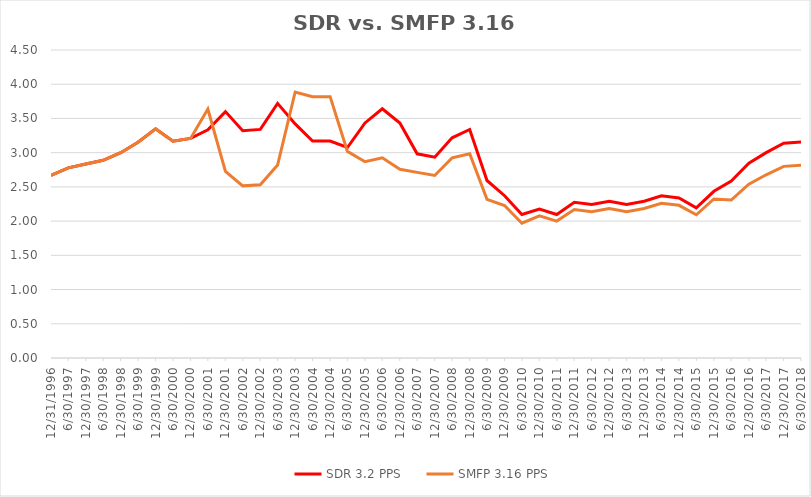
| Category | SDR 3.2 PPS | SMFP 3.16 PPS |
|---|---|---|
| 12/31/96 | 2.667 | 2.667 |
| 6/30/97 | 2.778 | 2.778 |
| 12/31/97 | 2.833 | 2.833 |
| 6/30/98 | 2.889 | 2.889 |
| 12/31/98 | 3 | 3 |
| 6/30/99 | 3.153 | 3.153 |
| 12/31/99 | 3.347 | 3.347 |
| 6/30/00 | 3.167 | 3.167 |
| 12/31/00 | 3.208 | 3.208 |
| 6/30/01 | 3.333 | 3.636 |
| 12/31/01 | 3.6 | 2.727 |
| 6/30/02 | 3.32 | 2.515 |
| 12/31/02 | 3.34 | 2.53 |
| 6/30/03 | 3.72 | 2.818 |
| 12/31/03 | 3.42 | 3.886 |
| 6/30/04 | 3.17 | 3.818 |
| 12/31/04 | 3.17 | 3.818 |
| 6/30/05 | 3.075 | 3.019 |
| 12/31/05 | 3.434 | 2.867 |
| 6/30/06 | 3.642 | 2.924 |
| 12/31/06 | 3.434 | 2.758 |
| 6/30/07 | 2.983 | 2.712 |
| 12/31/07 | 2.933 | 2.667 |
| 6/30/08 | 3.217 | 2.924 |
| 12/31/08 | 3.339 | 2.985 |
| 6/30/09 | 2.593 | 2.318 |
| 12/31/09 | 2.371 | 2.227 |
| 6/30/10 | 2.097 | 1.97 |
| 12/31/10 | 2.177 | 2.077 |
| 6/30/11 | 2.097 | 2 |
| 12/31/11 | 2.274 | 2.169 |
| 6/30/12 | 2.242 | 2.138 |
| 12/31/12 | 2.29 | 2.185 |
| 6/30/13 | 2.242 | 2.138 |
| 12/31/13 | 2.29 | 2.185 |
| 6/30/14 | 2.371 | 2.262 |
| 12/31/14 | 2.339 | 2.231 |
| 6/30/15 | 2.194 | 2.092 |
| 12/31/15 | 2.435 | 2.323 |
| 6/30/16 | 2.586 | 2.308 |
| 12/31/16 | 2.845 | 2.538 |
| 6/30/17 | 3 | 2.677 |
| 12/31/17 | 3.138 | 2.8 |
| 6/30/18 | 3.155 | 2.815 |